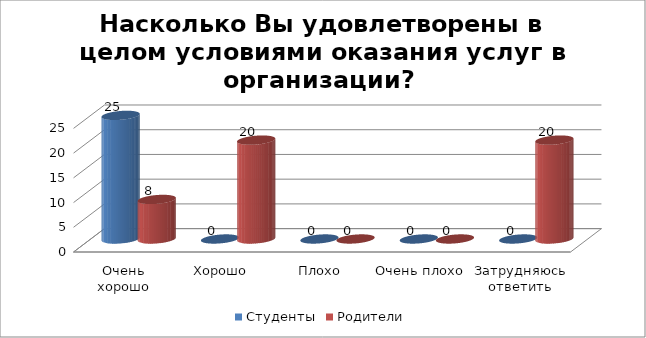
| Category | Студенты | Родители |
|---|---|---|
| Очень хорошо | 25 | 8 |
| Хорошо | 0 | 20 |
| Плохо | 0 | 0 |
| Очень плохо | 0 | 0 |
| Затрудняюсь ответить | 0 | 20 |